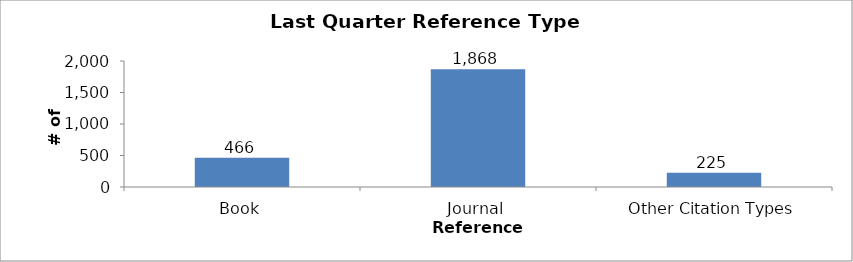
| Category | Total |
|---|---|
| Book | 466 |
| Journal | 1868 |
| Other Citation Types | 225 |